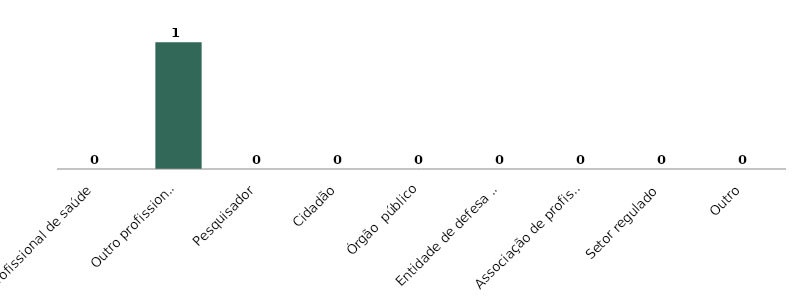
| Category | Series 0 |
|---|---|
| Profissional de saúde | 0 |
| Outro profissional | 1 |
| Pesquisador | 0 |
| Cidadão | 0 |
| Órgão  público | 0 |
| Entidade de defesa do consumidor | 0 |
| Associação de profissionais | 0 |
| Setor regulado | 0 |
| Outro | 0 |